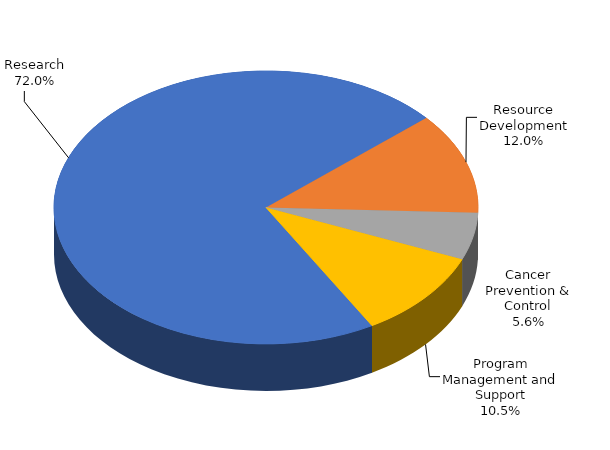
| Category | Research |
|---|---|
| 0 | 0.72 |
| 1 | 0.12 |
| 2 | 0.056 |
| 3 | 0.105 |